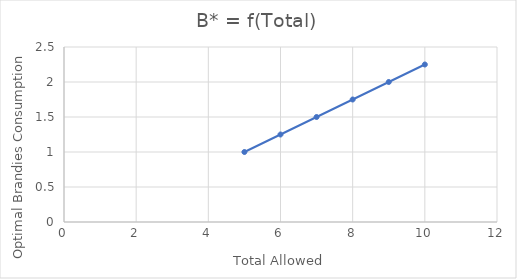
| Category | B* |
|---|---|
| 5.0 | 1 |
| 6.0 | 1.25 |
| 7.0 | 1.5 |
| 8.0 | 1.75 |
| 9.0 | 2 |
| 10.0 | 2.25 |